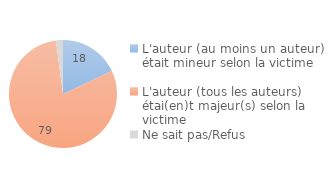
| Category | Series 0 |
|---|---|
| L'auteur (au moins un auteur) était mineur selon la victime | 17.866 |
| L'auteur (tous les auteurs) étai(en)t majeur(s) selon la victime | 79.194 |
| Ne sait pas/Refus | 2.092 |